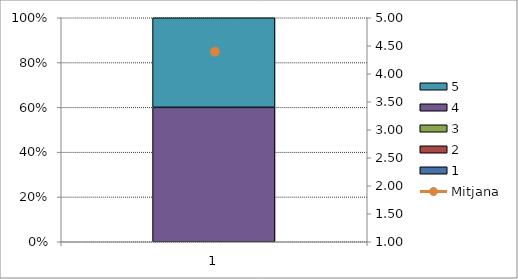
| Category | 1 | 2 | 3 | 4 | 5 |
|---|---|---|---|---|---|
| 0 | 0 | 0 | 0 | 6 | 4 |